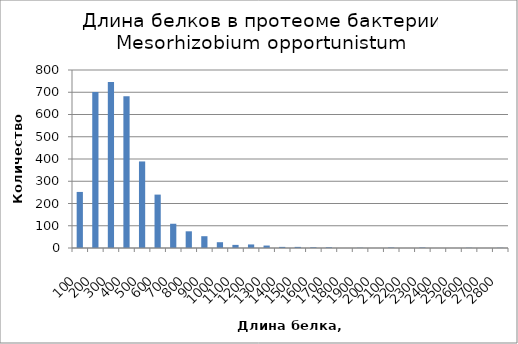
| Category | Частота |
|---|---|
| 100.0 | 252 |
| 200.0 | 701 |
| 300.0 | 746 |
| 400.0 | 682 |
| 500.0 | 389 |
| 600.0 | 240 |
| 700.0 | 109 |
| 800.0 | 75 |
| 900.0 | 53 |
| 1000.0 | 26 |
| 1100.0 | 14 |
| 1200.0 | 16 |
| 1300.0 | 11 |
| 1400.0 | 5 |
| 1500.0 | 5 |
| 1600.0 | 3 |
| 1700.0 | 3 |
| 1800.0 | 0 |
| 1900.0 | 1 |
| 2000.0 | 0 |
| 2100.0 | 2 |
| 2200.0 | 0 |
| 2300.0 | 2 |
| 2400.0 | 0 |
| 2500.0 | 0 |
| 2600.0 | 1 |
| 2700.0 | 0 |
| 2800.0 | 1 |